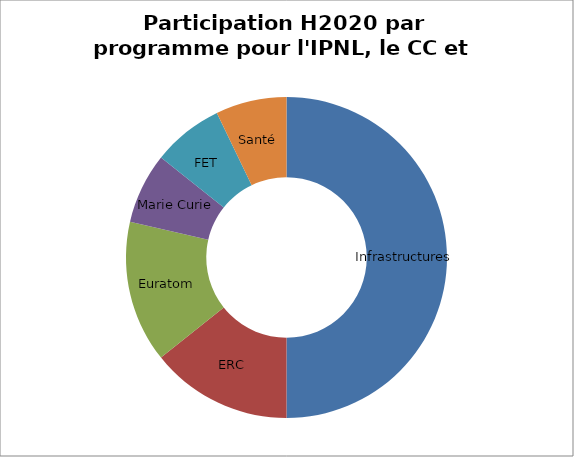
| Category | Series 0 |
|---|---|
| Infrastructures | 7 |
| ERC | 2 |
| Euratom | 2 |
| Marie Curie | 1 |
| FET  | 1 |
| Santé | 1 |